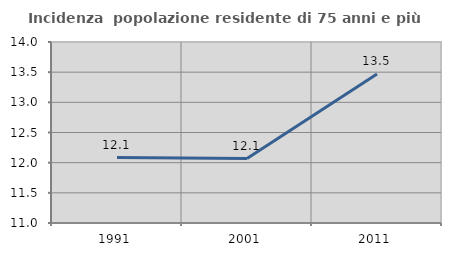
| Category | Incidenza  popolazione residente di 75 anni e più |
|---|---|
| 1991.0 | 12.084 |
| 2001.0 | 12.068 |
| 2011.0 | 13.47 |